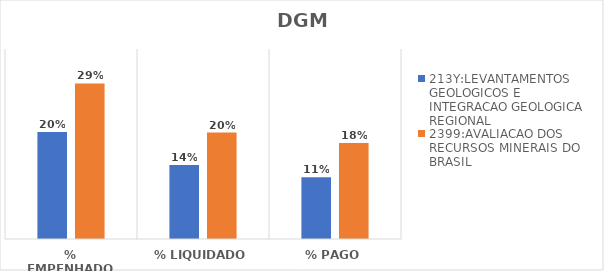
| Category | 213Y:LEVANTAMENTOS GEOLOGICOS E INTEGRACAO GEOLOGICA REGIONAL | 2399:AVALIACAO DOS RECURSOS MINERAIS DO BRASIL |
|---|---|---|
| % EMPENHADO | 0.197 | 0.287 |
| % LIQUIDADO | 0.136 | 0.196 |
| % PAGO | 0.114 | 0.177 |